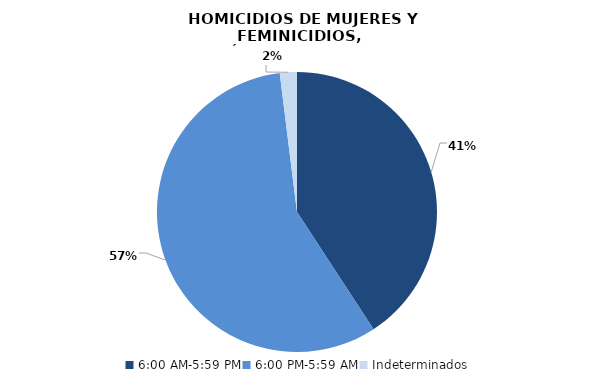
| Category | Series 0 |
|---|---|
| 6:00 AM-5:59 PM | 62 |
| 6:00 PM-5:59 AM | 87 |
| Indeterminados | 3 |